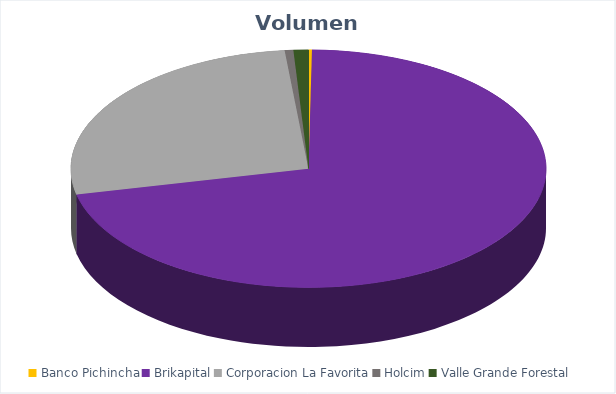
| Category | VOLUMEN ($USD) |
|---|---|
| Banco Pichincha | 1152 |
| Brikapital | 352000 |
| Corporacion La Favorita | 132859.53 |
| Holcim | 2898 |
| Valle Grande Forestal | 5002.4 |